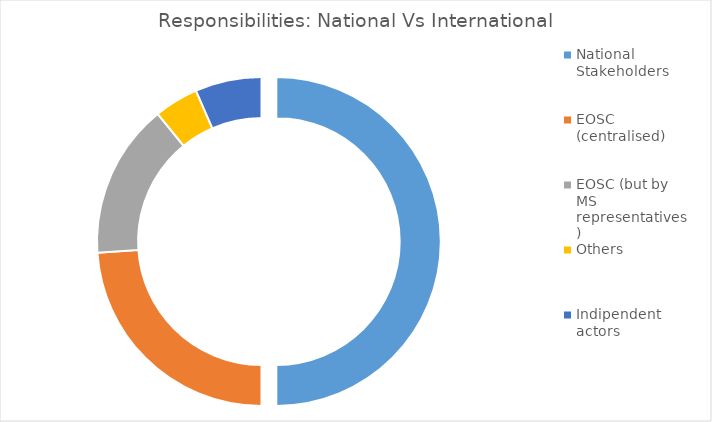
| Category | Series 0 |
|---|---|
| National Stakeholders | 23 |
| EOSC (centralised) | 11 |
| EOSC (but by MS representatives) | 7 |
| Others | 2 |
| Indipendent actors | 3 |